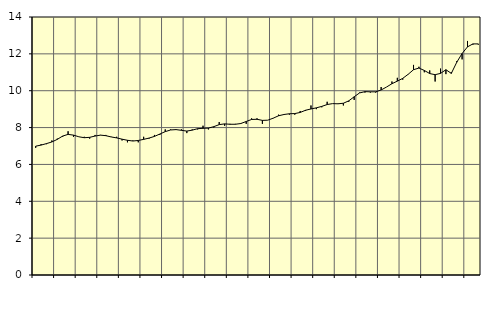
| Category | Piggar | Offentlig förvaltning m.m., SNI 84, 991 |
|---|---|---|
| nan | 6.9 | 6.99 |
| 1.0 | 7.1 | 7.05 |
| 1.0 | 7.1 | 7.13 |
| 1.0 | 7.3 | 7.22 |
| nan | 7.4 | 7.36 |
| 2.0 | 7.5 | 7.54 |
| 2.0 | 7.8 | 7.63 |
| 2.0 | 7.5 | 7.59 |
| nan | 7.5 | 7.5 |
| 3.0 | 7.5 | 7.45 |
| 3.0 | 7.4 | 7.47 |
| 3.0 | 7.6 | 7.54 |
| nan | 7.6 | 7.59 |
| 4.0 | 7.6 | 7.56 |
| 4.0 | 7.5 | 7.49 |
| 4.0 | 7.5 | 7.44 |
| nan | 7.3 | 7.37 |
| 5.0 | 7.2 | 7.31 |
| 5.0 | 7.3 | 7.27 |
| 5.0 | 7.2 | 7.3 |
| nan | 7.5 | 7.36 |
| 6.0 | 7.4 | 7.43 |
| 6.0 | 7.6 | 7.52 |
| 6.0 | 7.6 | 7.65 |
| nan | 7.9 | 7.78 |
| 7.0 | 7.9 | 7.87 |
| 7.0 | 7.9 | 7.89 |
| 7.0 | 7.9 | 7.85 |
| nan | 7.7 | 7.81 |
| 8.0 | 7.9 | 7.86 |
| 8.0 | 7.9 | 7.94 |
| 8.0 | 8.1 | 7.96 |
| nan | 7.9 | 7.97 |
| 9.0 | 8 | 8.05 |
| 9.0 | 8.3 | 8.16 |
| 9.0 | 8.1 | 8.2 |
| nan | 8.2 | 8.18 |
| 10.0 | 8.2 | 8.18 |
| 10.0 | 8.2 | 8.22 |
| 10.0 | 8.2 | 8.33 |
| nan | 8.5 | 8.44 |
| 11.0 | 8.5 | 8.45 |
| 11.0 | 8.2 | 8.39 |
| 11.0 | 8.4 | 8.4 |
| nan | 8.5 | 8.51 |
| 12.0 | 8.7 | 8.64 |
| 12.0 | 8.7 | 8.71 |
| 12.0 | 8.7 | 8.75 |
| nan | 8.7 | 8.76 |
| 13.0 | 8.9 | 8.82 |
| 13.0 | 8.9 | 8.94 |
| 13.0 | 9.2 | 9.01 |
| nan | 9 | 9.07 |
| 14.0 | 9.1 | 9.15 |
| 14.0 | 9.4 | 9.25 |
| 14.0 | 9.3 | 9.3 |
| nan | 9.3 | 9.29 |
| 15.0 | 9.2 | 9.32 |
| 15.0 | 9.4 | 9.45 |
| 15.0 | 9.5 | 9.67 |
| nan | 9.9 | 9.88 |
| 16.0 | 9.9 | 9.95 |
| 16.0 | 9.9 | 9.94 |
| 16.0 | 9.9 | 9.94 |
| nan | 10.2 | 10.04 |
| 17.0 | 10.2 | 10.2 |
| 17.0 | 10.5 | 10.38 |
| 17.0 | 10.7 | 10.52 |
| nan | 10.6 | 10.67 |
| 18.0 | 10.9 | 10.89 |
| 18.0 | 11.4 | 11.14 |
| 18.0 | 11.3 | 11.23 |
| nan | 11 | 11.1 |
| 19.0 | 11.1 | 10.93 |
| 19.0 | 10.5 | 10.87 |
| 19.0 | 11.2 | 10.94 |
| nan | 10.9 | 11.14 |
| 20.0 | 11 | 10.94 |
| 20.0 | 11.6 | 11.54 |
| 20.0 | 11.7 | 12.02 |
| nan | 12.7 | 12.38 |
| 21.0 | 12.5 | 12.54 |
| 21.0 | 12.5 | 12.54 |